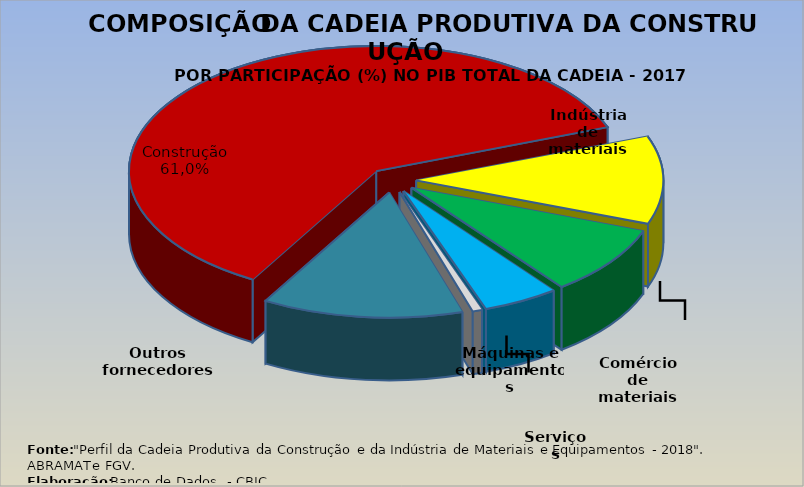
| Category | Participação |
|---|---|
| Construção | 0.61 |
| Indústria de materiais | 0.114 |
| Comércio de materiais | 0.09 |
| Serviços | 0.05 |
| Máquinas e equipamentos | 0.006 |
| Outros fornecedores | 0.131 |